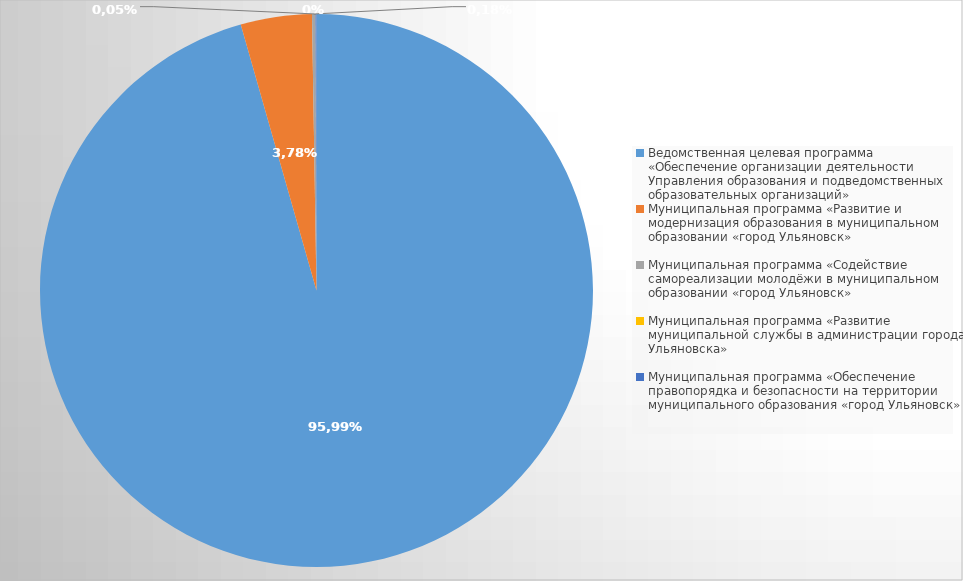
| Category | Series 0 |
|---|---|
| Ведомственная целевая программа «Обеспечение организации деятельности Управления образования и подведомственных образовательных организаций» | 4454383 |
| Муниципальная программа «Развитие и модернизация образования в муниципальном образовании «город Ульяновск» | 193717 |
| Муниципальная программа «Содействие самореализации молодёжи в муниципальном образовании «город Ульяновск» | 9331.7 |
| Муниципальная программа «Развитие муниципальной службы в администрации города Ульяновска» | 78.7 |
| Муниципальная программа «Обеспечение правопорядка и безопасности на территории муниципального образования «город Ульяновск» | 2710 |